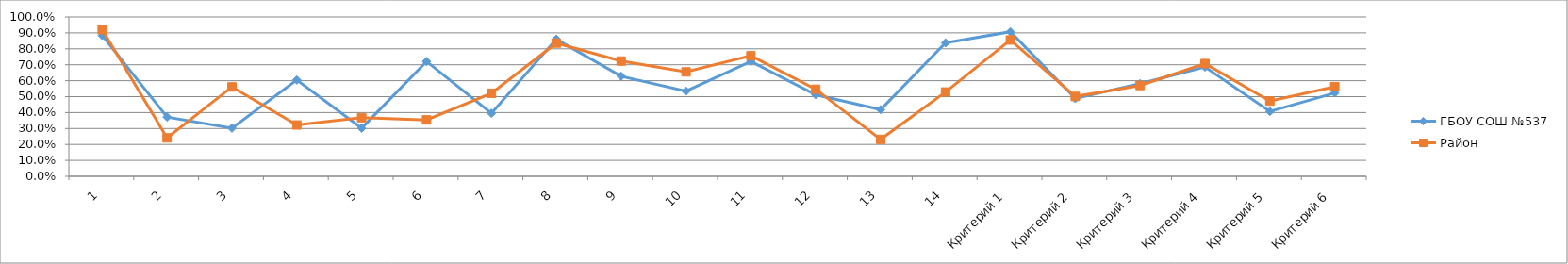
| Category | ГБОУ СОШ №537 | Район |
|---|---|---|
| 1 | 0.884 | 0.92 |
| 2 | 0.372 | 0.241 |
| 3 | 0.302 | 0.561 |
| 4 | 0.605 | 0.322 |
| 5 | 0.302 | 0.368 |
| 6 | 0.721 | 0.354 |
| 7 | 0.395 | 0.521 |
| 8 | 0.86 | 0.836 |
| 9 | 0.628 | 0.723 |
| 10 | 0.535 | 0.655 |
| 11 | 0.721 | 0.756 |
| 12 | 0.512 | 0.546 |
| 13 | 0.419 | 0.232 |
| 14 | 0.837 | 0.529 |
| Критерий 1 | 0.907 | 0.855 |
| Критерий 2 | 0.488 | 0.501 |
| Критерий 3 | 0.581 | 0.57 |
| Критерий 4 | 0.686 | 0.707 |
| Критерий 5 | 0.407 | 0.472 |
| Критерий 6 | 0.523 | 0.562 |